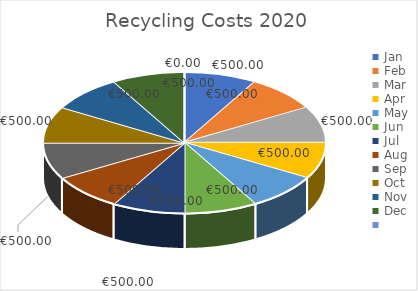
| Category | Series 0 |
|---|---|
| Jan | 500 |
| Feb | 500 |
| Mar | 500 |
| Apr | 500 |
| May | 500 |
| Jun | 500 |
| Jul | 500 |
| Aug | 500 |
| Sep | 500 |
| Oct | 500 |
| Nov | 500 |
| Dec | 500 |